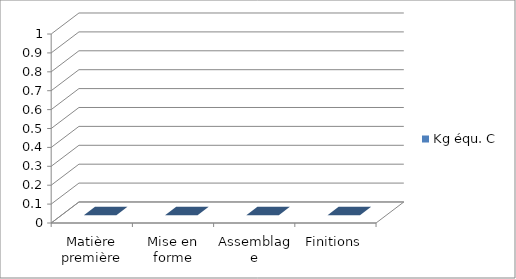
| Category | Kg équ. C |
|---|---|
| Matière première | 0 |
| Mise en forme | 0 |
| Assemblage | 0 |
| Finitions | 0 |